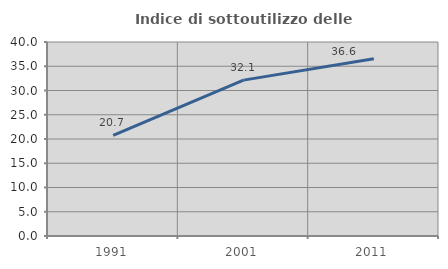
| Category | Indice di sottoutilizzo delle abitazioni  |
|---|---|
| 1991.0 | 20.732 |
| 2001.0 | 32.143 |
| 2011.0 | 36.559 |